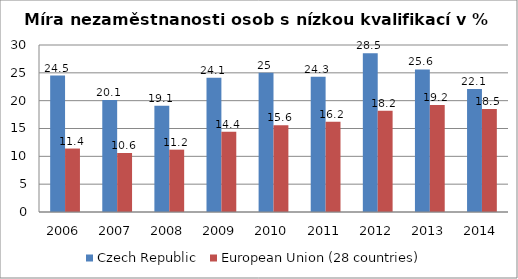
| Category | Czech Republic | European Union (28 countries) |
|---|---|---|
| 2006 | 24.5 | 11.4 |
| 2007 | 20.1 | 10.6 |
| 2008 | 19.1 | 11.2 |
| 2009 | 24.1 | 14.4 |
| 2010 | 25 | 15.6 |
| 2011 | 24.3 | 16.2 |
| 2012 | 28.5 | 18.2 |
| 2013 | 25.6 | 19.2 |
| 2014 | 22.1 | 18.5 |